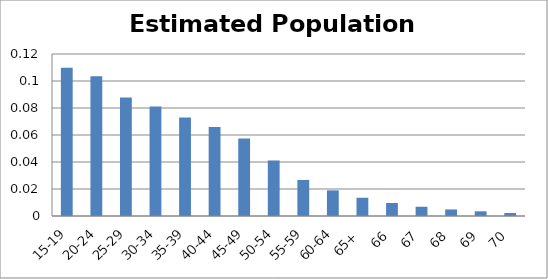
| Category | Series 0 |
|---|---|
| 15-19 | 0.11 |
| 20-24 | 0.103 |
| 25-29 | 0.088 |
| 30-34 | 0.081 |
| 35-39 | 0.073 |
| 40-44 | 0.066 |
| 45-49 | 0.057 |
| 50-54 | 0.041 |
| 55-59 | 0.027 |
| 60-64 | 0.019 |
| 65+ | 0.014 |
| 66 | 0.01 |
| 67 | 0.007 |
| 68 | 0.005 |
| 69 | 0.003 |
| 70 | 0.002 |